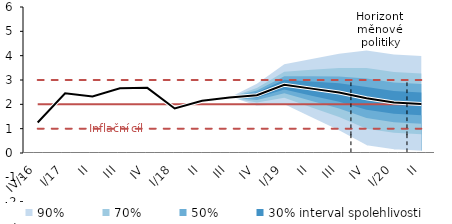
| Category | Inflation Target | Inflation Target - lower bound | Inflation Target - upper bound | linka | Střed předpovědi |
|---|---|---|---|---|---|
| IV/16 | 2 | 1 | 3 | 1.256 | 1.256 |
| I/17 | 2 | 1 | 3 | 2.455 | 2.455 |
| II | 2 | 1 | 3 | 2.327 | 2.327 |
| III | 2 | 1 | 3 | 2.66 | 2.66 |
| IV | 2 | 1 | 3 | 2.677 | 2.677 |
| I/18 | 2 | 1 | 3 | 1.831 | 1.831 |
| II | 2 | 1 | 3 | 2.145 | 2.145 |
| III | 2 | 1 | 3 | 2.279 | 2.279 |
| IV | 2 | 1 | 3 | 2.377 | 2.377 |
| I/19 | 2 | 1 | 3 | 2.807 | 2.807 |
| II | 2 | 1 | 3 | 2.645 | 2.645 |
| III | 2 | 1 | 3 | 2.487 | 2.487 |
| IV | 2 | 1 | 3 | 2.249 | 2.249 |
| I/20 | 2 | 1 | 3 | 2.078 | 2.078 |
| II | 2 | 1 | 3 | 2.018 | 2.018 |